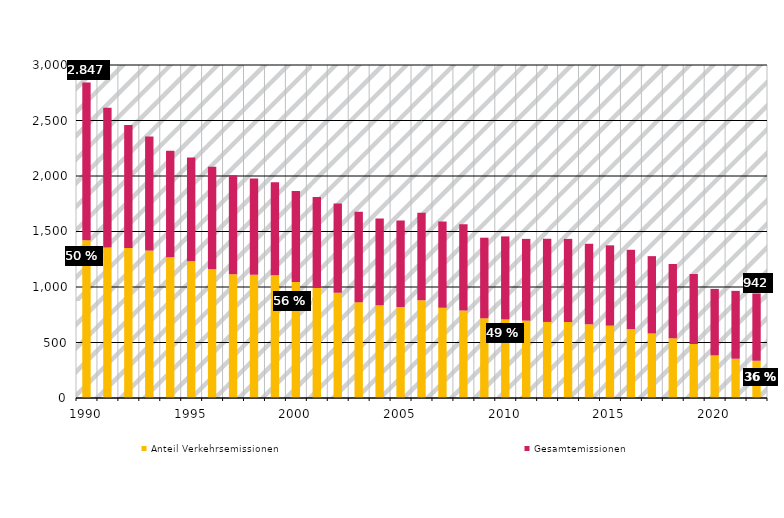
| Category | Anteil Verkehrsemissionen | Gesamtemissionen |
|---|---|---|
| 1990.0 | 1420.747 | 1421.523 |
| nan | 1355.904 | 1258.911 |
| nan | 1351.442 | 1108.34 |
| nan | 1329.762 | 1027.112 |
| nan | 1266.952 | 960 |
| 1995.0 | 1231.042 | 935.945 |
| nan | 1160.675 | 922.398 |
| nan | 1115.795 | 892.003 |
| nan | 1109.249 | 869.209 |
| nan | 1106.289 | 836.474 |
| 2000.0 | 1044.308 | 821.208 |
| nan | 990.441 | 820.393 |
| nan | 949.057 | 802.849 |
| nan | 863.668 | 815.335 |
| nan | 836.568 | 780.586 |
| 2005.0 | 818.927 | 779.83 |
| nan | 879.886 | 788.676 |
| nan | 813.132 | 777.087 |
| nan | 788.577 | 776.363 |
| nan | 718.422 | 725.695 |
| 2010.0 | 708.542 | 747.227 |
| nan | 697.387 | 735.952 |
| nan | 685.004 | 749.567 |
| nan | 684.463 | 748.979 |
| nan | 664.003 | 725.512 |
| 2015.0 | 651.743 | 723.496 |
| nan | 620.433 | 714.973 |
| nan | 581.443 | 696.5 |
| nan | 538.272 | 669.037 |
| nan | 486.627 | 630.254 |
| 2020.0 | 383.313 | 599.51 |
| nan | 353.675 | 611.432 |
| nan | 335.177 | 606.813 |